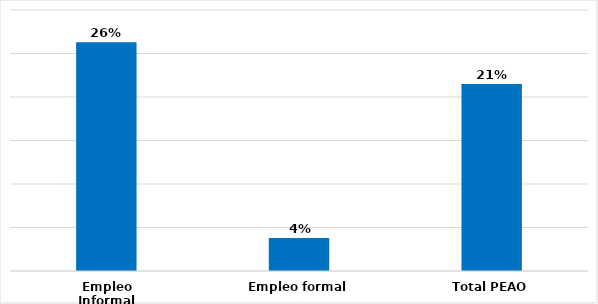
| Category | Series 0 |
|---|---|
| Empleo Informal | 0.263 |
| Empleo formal | 0.038 |
| Total PEAO | 0.215 |